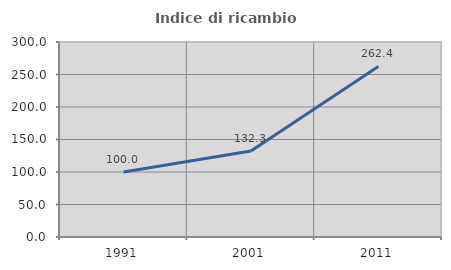
| Category | Indice di ricambio occupazionale  |
|---|---|
| 1991.0 | 100 |
| 2001.0 | 132.34 |
| 2011.0 | 262.42 |